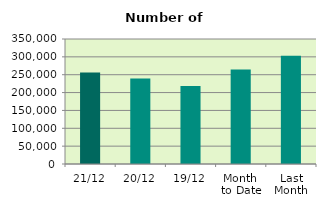
| Category | Series 0 |
|---|---|
| 21/12 | 255998 |
| 20/12 | 239582 |
| 19/12 | 218138 |
| Month 
to Date | 264827.467 |
| Last
Month | 303258.727 |